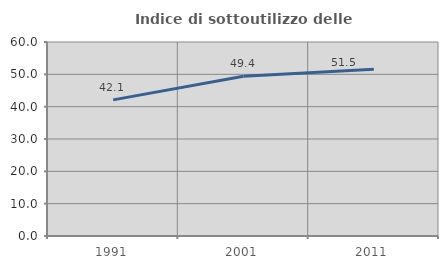
| Category | Indice di sottoutilizzo delle abitazioni  |
|---|---|
| 1991.0 | 42.1 |
| 2001.0 | 49.43 |
| 2011.0 | 51.536 |